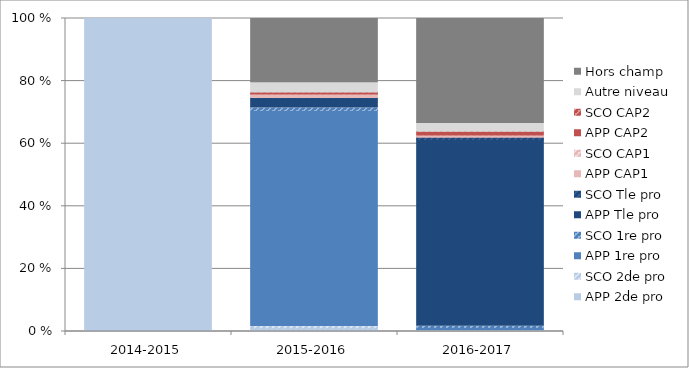
| Category | APP 2de pro | SCO 2de pro | APP 1re pro | SCO 1re pro | APP Tle pro | SCO Tle pro | APP CAP1 | SCO CAP1 | APP CAP2 | SCO CAP2 | Autre niveau | Hors champ |
|---|---|---|---|---|---|---|---|---|---|---|---|---|
| 2014-2015 | 100 | 0 | 0 | 0 | 0 | 0 | 0 | 0 | 0 | 0 | 0 | 0 |
| 2015-2016 | 1.17 | 0.39 | 69.05 | 0.78 | 3.29 | 0.09 | 1.03 | 0.08 | 0.63 | 0.03 | 3.27 | 20.2 |
| 2016-2017 | 0.19 | 0.04 | 1.07 | 0.41 | 59.61 | 0.76 | 0.72 | 0.01 | 1.07 | 0.08 | 2.82 | 33.23 |